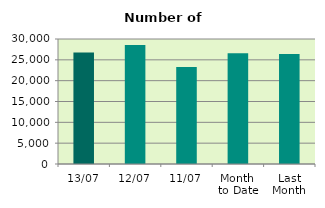
| Category | Series 0 |
|---|---|
| 13/07 | 26760 |
| 12/07 | 28570 |
| 11/07 | 23252 |
| Month 
to Date | 26602.444 |
| Last
Month | 26399.455 |